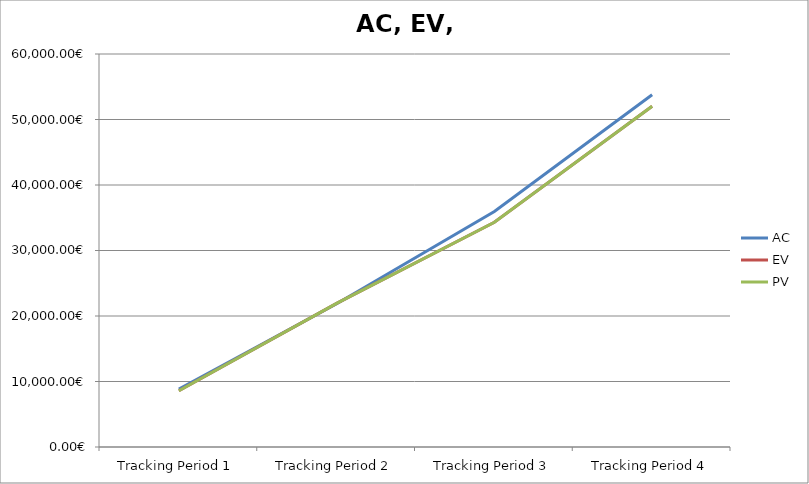
| Category | AC | EV | PV |
|---|---|---|---|
| Tracking Period 1 | 8828.88 | 8584.88 | 8584.88 |
| Tracking Period 2 | 21873.89 | 21928.89 | 21928.89 |
| Tracking Period 3 | 35946.72 | 34313.72 | 34313.72 |
| Tracking Period 4 | 53783.28 | 52021.28 | 52021.28 |